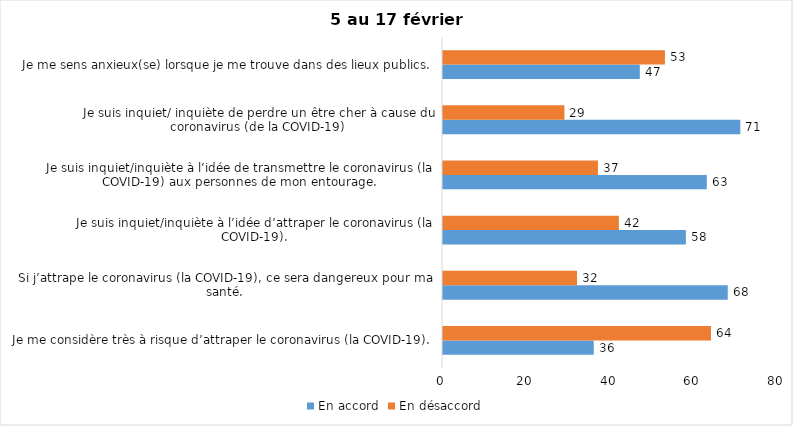
| Category | En accord | En désaccord |
|---|---|---|
| Je me considère très à risque d’attraper le coronavirus (la COVID-19). | 36 | 64 |
| Si j’attrape le coronavirus (la COVID-19), ce sera dangereux pour ma santé. | 68 | 32 |
| Je suis inquiet/inquiète à l’idée d’attraper le coronavirus (la COVID-19). | 58 | 42 |
| Je suis inquiet/inquiète à l’idée de transmettre le coronavirus (la COVID-19) aux personnes de mon entourage. | 63 | 37 |
| Je suis inquiet/ inquiète de perdre un être cher à cause du coronavirus (de la COVID-19) | 71 | 29 |
| Je me sens anxieux(se) lorsque je me trouve dans des lieux publics. | 47 | 53 |